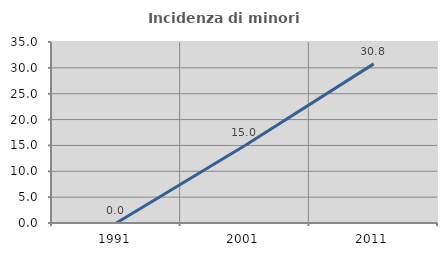
| Category | Incidenza di minori stranieri |
|---|---|
| 1991.0 | 0 |
| 2001.0 | 15 |
| 2011.0 | 30.769 |